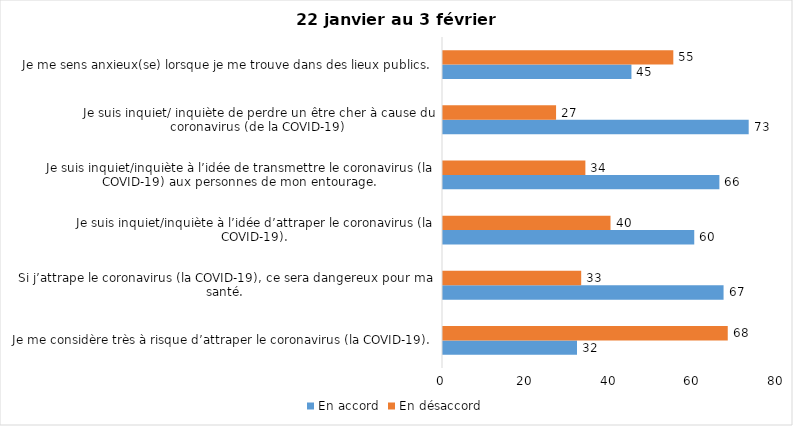
| Category | En accord | En désaccord |
|---|---|---|
| Je me considère très à risque d’attraper le coronavirus (la COVID-19). | 32 | 68 |
| Si j’attrape le coronavirus (la COVID-19), ce sera dangereux pour ma santé. | 67 | 33 |
| Je suis inquiet/inquiète à l’idée d’attraper le coronavirus (la COVID-19). | 60 | 40 |
| Je suis inquiet/inquiète à l’idée de transmettre le coronavirus (la COVID-19) aux personnes de mon entourage. | 66 | 34 |
| Je suis inquiet/ inquiète de perdre un être cher à cause du coronavirus (de la COVID-19) | 73 | 27 |
| Je me sens anxieux(se) lorsque je me trouve dans des lieux publics. | 45 | 55 |